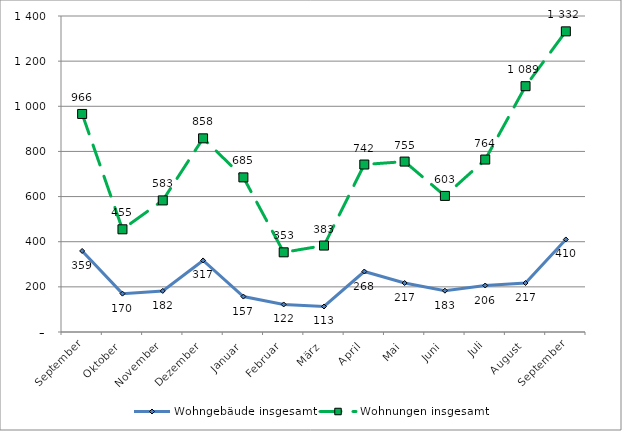
| Category | Wohngebäude insgesamt | Wohnungen insgesamt |
|---|---|---|
| September | 359 | 966 |
| Oktober | 170 | 455 |
| November | 182 | 583 |
| Dezember | 317 | 858 |
| Januar | 157 | 685 |
| Februar | 122 | 353 |
| März | 113 | 383 |
| April | 268 | 742 |
| Mai | 217 | 755 |
| Juni | 183 | 603 |
| Juli | 206 | 764 |
| August | 217 | 1089 |
| September | 410 | 1332 |